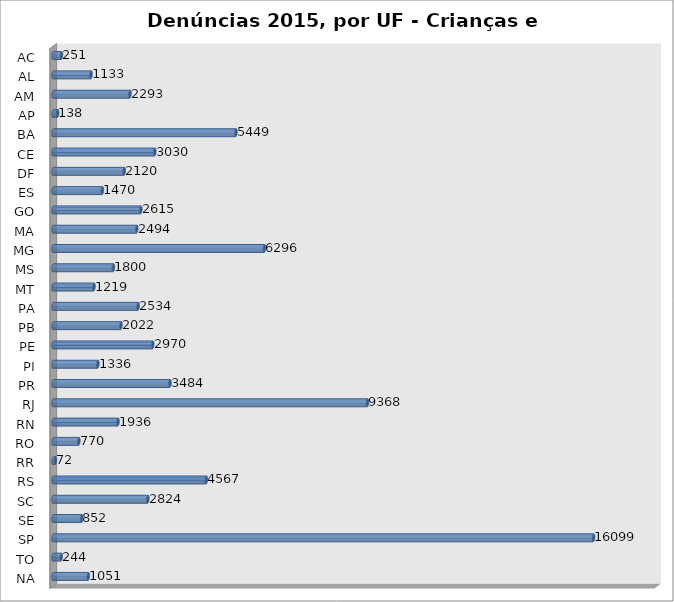
| Category | Series 0 |
|---|---|
| AC | 251 |
| AL | 1133 |
| AM | 2293 |
| AP | 138 |
| BA | 5449 |
| CE | 3030 |
| DF | 2120 |
| ES | 1470 |
| GO | 2615 |
| MA | 2494 |
| MG | 6296 |
| MS | 1800 |
| MT | 1219 |
| PA | 2534 |
| PB | 2022 |
| PE | 2970 |
| PI | 1336 |
| PR | 3484 |
| RJ | 9368 |
| RN | 1936 |
| RO | 770 |
| RR | 72 |
| RS | 4567 |
| SC | 2824 |
| SE | 852 |
| SP | 16099 |
| TO | 244 |
| NA | 1051 |